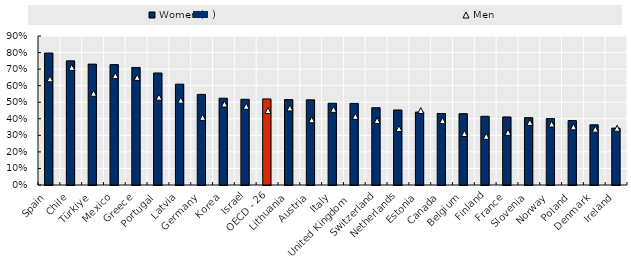
| Category | Women (↓) |
|---|---|
| Spain | 0.797 |
| Chile | 0.75 |
| Türkiye | 0.73 |
| Mexico | 0.727 |
| Greece | 0.71 |
| Portugal | 0.677 |
| Latvia | 0.609 |
| Germany | 0.547 |
| Korea | 0.524 |
| Israel | 0.518 |
| OECD - 26 | 0.52 |
| Lithuania | 0.516 |
| Austria | 0.514 |
| Italy | 0.494 |
| United Kingdom  | 0.493 |
| Switzerland | 0.467 |
| Netherlands | 0.453 |
| Estonia | 0.441 |
| Canada | 0.432 |
| Belgium | 0.431 |
| Finland | 0.415 |
| France | 0.411 |
| Slovenia | 0.407 |
| Norway | 0.401 |
| Poland | 0.389 |
| Denmark | 0.364 |
| Ireland | 0.343 |